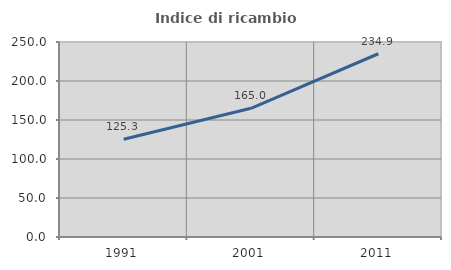
| Category | Indice di ricambio occupazionale  |
|---|---|
| 1991.0 | 125.301 |
| 2001.0 | 165 |
| 2011.0 | 234.94 |